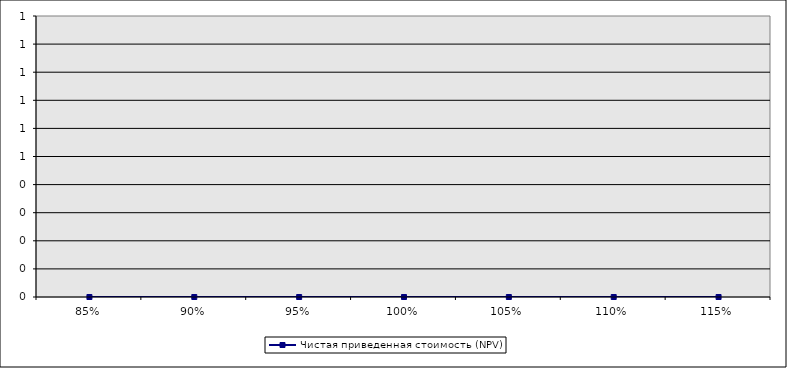
| Category | Чистая приведенная стоимость (NPV) |
|---|---|
| 0.85 | 0 |
| 0.9 | 0 |
| 0.9500000000000001 | 0 |
| 1.0 | 0 |
| 1.05 | 0 |
| 1.1 | 0 |
| 1.1500000000000001 | 0 |